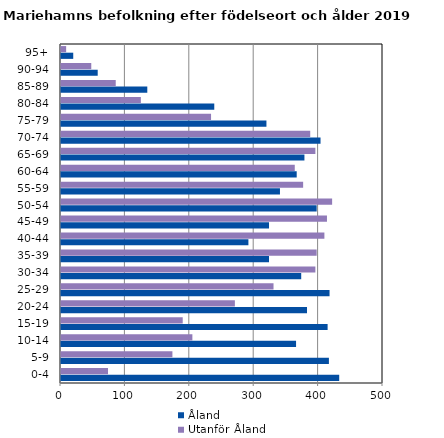
| Category | Åland | Utanför Åland |
|---|---|---|
| 0-4 | 432 | 73 |
| 5-9 | 416 | 173 |
| 10-14 | 365 | 204 |
| 15-19 | 414 | 189 |
| 20-24 | 382 | 270 |
| 25-29 | 417 | 330 |
| 30-34 | 373 | 395 |
| 35-39 | 323 | 397 |
| 40-44 | 291 | 409 |
| 45-49 | 323 | 413 |
| 50-54 | 397 | 421 |
| 55-59 | 340 | 376 |
| 60-64 | 366 | 363 |
| 65-69 | 378 | 395 |
| 70-74 | 403 | 387 |
| 75-79 | 319 | 233 |
| 80-84 | 238 | 124 |
| 85-89 | 134 | 85 |
| 90-94 | 57 | 47 |
| 95+ | 19 | 8 |